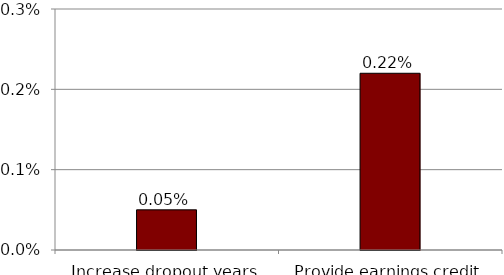
| Category | Series 0 |
|---|---|
| Increase dropout years | 0 |
| Provide earnings credit | 0.002 |